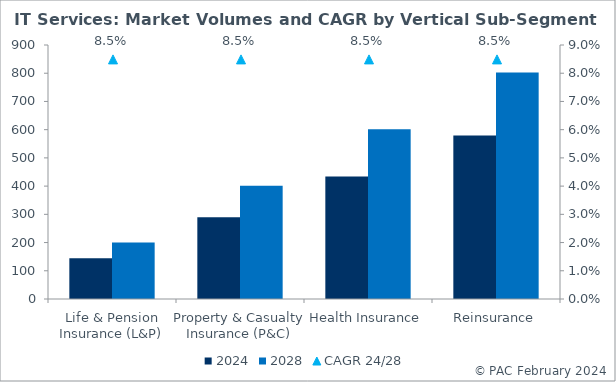
| Category | 2024 | 2028 |
|---|---|---|
| Life & Pension Insurance (L&P) | 144.771 | 200.555 |
| Property & Casualty Insurance (P&C) | 289.542 | 401.111 |
| Health Insurance | 434.313 | 601.666 |
| Reinsurance | 579.084 | 802.222 |